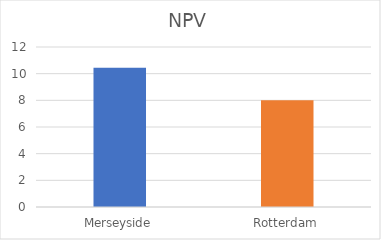
| Category | Series 0 |
|---|---|
| Merseyside | 10.45 |
| Rotterdam | 8 |